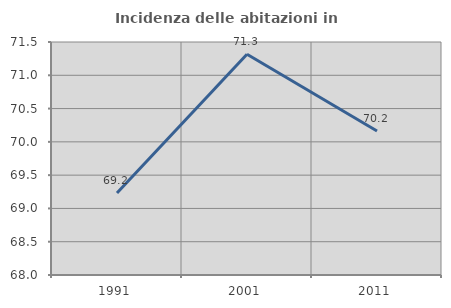
| Category | Incidenza delle abitazioni in proprietà  |
|---|---|
| 1991.0 | 69.231 |
| 2001.0 | 71.315 |
| 2011.0 | 70.163 |